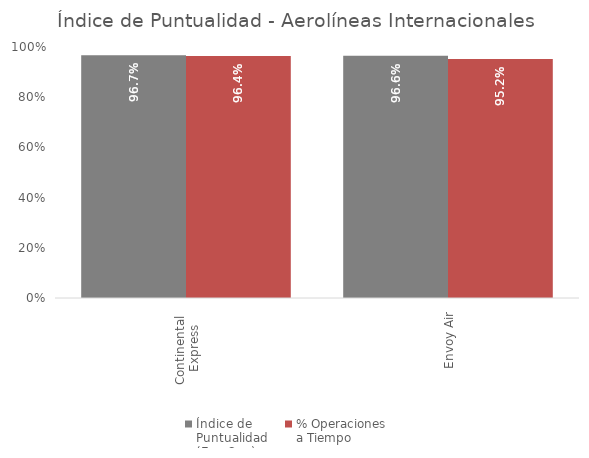
| Category | Índice de 
Puntualidad
(Ene-Sep) | % Operaciones 
a Tiempo |
|---|---|---|
| Continental 
Express | 0.967 | 0.964 |
| Envoy Air | 0.966 | 0.952 |